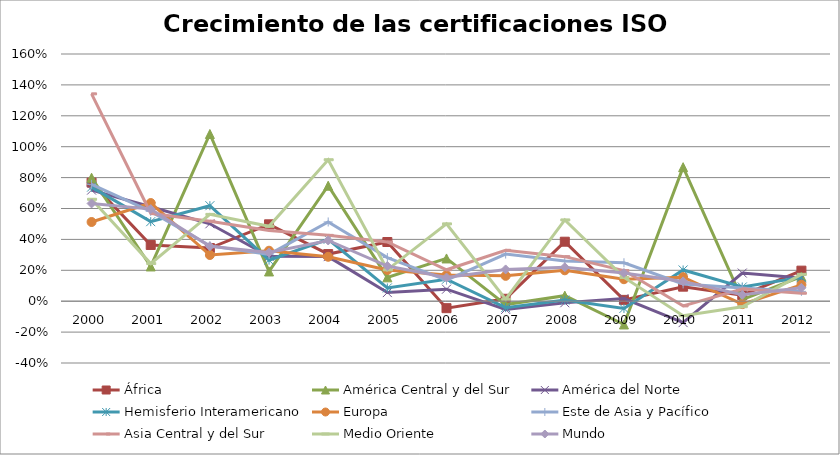
| Category | África | América Central y del Sur | América del Norte | Hemisferio Interamericano | Europa | Este de Asia y Pacífico | Asia Central y del Sur | Medio Oriente | Mundo |
|---|---|---|---|---|---|---|---|---|---|
| 2000.0 | 0.767 | 0.799 | 0.719 | 0.738 | 0.513 | 0.756 | 1.342 | 0.66 | 0.633 |
| 2001.0 | 0.364 | 0.225 | 0.611 | 0.515 | 0.635 | 0.581 | 0.569 | 0.244 | 0.596 |
| 2002.0 | 0.344 | 1.082 | 0.501 | 0.618 | 0.299 | 0.358 | 0.518 | 0.562 | 0.356 |
| 2003.0 | 0.498 | 0.193 | 0.291 | 0.266 | 0.327 | 0.303 | 0.458 | 0.485 | 0.315 |
| 2004.0 | 0.305 | 0.747 | 0.289 | 0.401 | 0.287 | 0.513 | 0.426 | 0.916 | 0.393 |
| 2005.0 | 0.383 | 0.154 | 0.056 | 0.086 | 0.202 | 0.283 | 0.384 | 0.203 | 0.228 |
| 2006.0 | -0.045 | 0.277 | 0.078 | 0.142 | 0.169 | 0.136 | 0.203 | 0.5 | 0.153 |
| 2007.0 | 0.016 | -0.022 | -0.053 | -0.042 | 0.164 | 0.305 | 0.329 | 0.013 | 0.206 |
| 2008.0 | 0.385 | 0.036 | -0.01 | 0.007 | 0.2 | 0.26 | 0.288 | 0.526 | 0.22 |
| 2009.0 | 0.009 | -0.151 | 0.017 | -0.047 | 0.142 | 0.249 | 0.198 | 0.154 | 0.182 |
| 2010.0 | 0.094 | 0.867 | -0.139 | 0.202 | 0.156 | 0.112 | -0.03 | -0.094 | 0.128 |
| 2011.0 | 0.039 | 0.011 | 0.182 | 0.092 | -0.019 | 0.085 | 0.079 | -0.036 | 0.041 |
| 2012.0 | 0.198 | 0.159 | 0.151 | 0.155 | 0.106 | 0.064 | 0.052 | 0.174 | 0.087 |